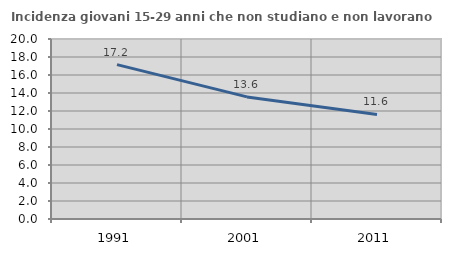
| Category | Incidenza giovani 15-29 anni che non studiano e non lavorano  |
|---|---|
| 1991.0 | 17.153 |
| 2001.0 | 13.568 |
| 2011.0 | 11.618 |